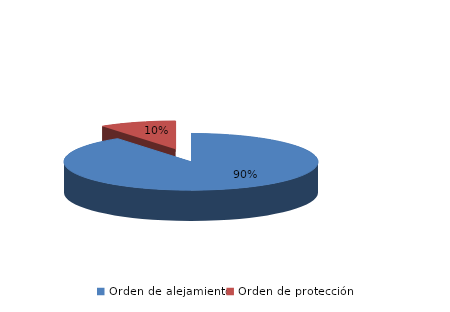
| Category | Series 0 |
|---|---|
| Orden de alejamiento | 589 |
| Orden de protección | 64 |